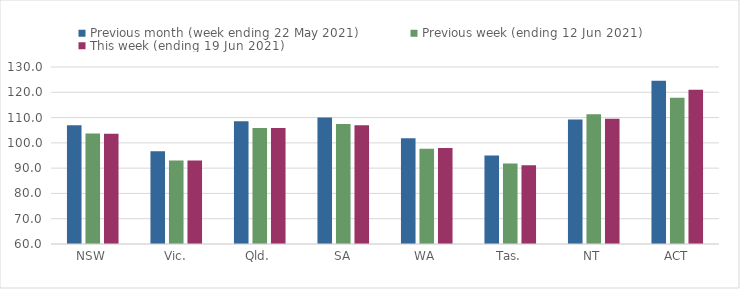
| Category | Previous month (week ending 22 May 2021) | Previous week (ending 12 Jun 2021) | This week (ending 19 Jun 2021) |
|---|---|---|---|
| NSW | 106.93 | 103.66 | 103.59 |
| Vic. | 96.64 | 93.03 | 93.04 |
| Qld. | 108.5 | 105.88 | 105.86 |
| SA | 110.01 | 107.48 | 107.01 |
| WA | 101.87 | 97.7 | 98 |
| Tas. | 94.97 | 91.87 | 91.16 |
| NT | 109.23 | 111.28 | 109.58 |
| ACT | 124.58 | 117.8 | 121.02 |